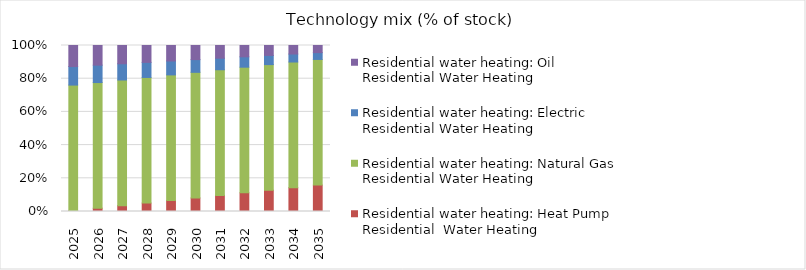
| Category | Residential water heating: Heat Pump Residential  Water Heating | Residential water heating: Natural Gas Residential Water Heating | Residential water heating: Electric Residential Water Heating | Residential water heating: Oil Residential Water Heating |
|---|---|---|---|---|
| 2025.0 | 0.005 | 0.757 | 0.112 | 0.127 |
| 2026.0 | 0.02 | 0.757 | 0.105 | 0.118 |
| 2027.0 | 0.035 | 0.757 | 0.098 | 0.11 |
| 2028.0 | 0.051 | 0.757 | 0.091 | 0.102 |
| 2029.0 | 0.066 | 0.757 | 0.084 | 0.093 |
| 2030.0 | 0.082 | 0.757 | 0.077 | 0.085 |
| 2031.0 | 0.097 | 0.757 | 0.07 | 0.077 |
| 2032.0 | 0.113 | 0.757 | 0.063 | 0.068 |
| 2033.0 | 0.128 | 0.757 | 0.055 | 0.06 |
| 2034.0 | 0.144 | 0.757 | 0.048 | 0.051 |
| 2035.0 | 0.159 | 0.757 | 0.041 | 0.043 |